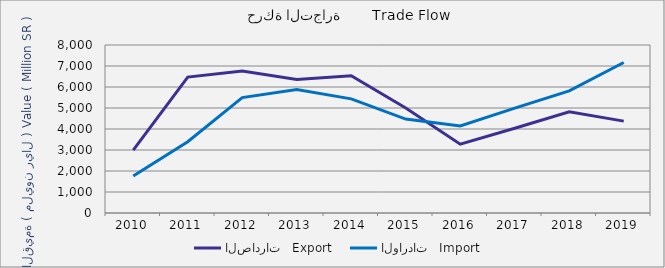
| Category | الصادرات   Export | الواردات   Import |
|---|---|---|
| 2010.0 | 2995222920 | 1761555959 |
| 2011.0 | 6471285372 | 3391882347 |
| 2012.0 | 6761591647 | 5493367318 |
| 2013.0 | 6355373125 | 5883363285 |
| 2014.0 | 6532768327 | 5435374641 |
| 2015.0 | 5004713901 | 4474251310 |
| 2016.0 | 3275427329 | 4144484740 |
| 2017.0 | 4038036240 | 4993645464 |
| 2018.0 | 4820232682 | 5817659708 |
| 2019.0 | 4375856532 | 7166614918 |